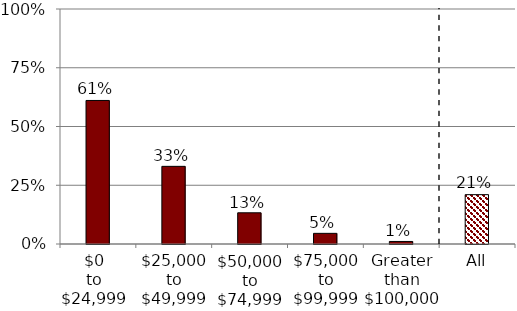
| Category | SCF |
|---|---|
| $0 to $24,999 | 0.611 |
| $25,000 to $49,999 | 0.33 |
| $50,000 to $74,999 | 0.133 |
| $75,000 to $99,999 | 0.045 |
| Greater than $100,000 | 0.011 |
| All | 0.21 |